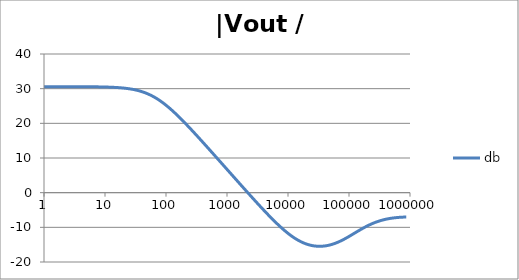
| Category | db |
|---|---|
| 1.0 | 30.579 |
| 1.0715193052376064 | 30.579 |
| 1.1481536214968828 | 30.579 |
| 1.2302687708123814 | 30.578 |
| 1.318256738556407 | 30.578 |
| 1.4125375446227544 | 30.578 |
| 1.513561248436208 | 30.578 |
| 1.6218100973589298 | 30.577 |
| 1.7378008287493754 | 30.577 |
| 1.8620871366628673 | 30.576 |
| 1.9952623149688797 | 30.576 |
| 2.1379620895022318 | 30.575 |
| 2.2908676527677727 | 30.575 |
| 2.45470891568503 | 30.574 |
| 2.6302679918953817 | 30.573 |
| 2.8183829312644537 | 30.572 |
| 3.0199517204020156 | 30.57 |
| 3.235936569296282 | 30.569 |
| 3.467368504525316 | 30.567 |
| 3.7153522909717256 | 30.565 |
| 3.9810717055349727 | 30.563 |
| 4.265795188015926 | 30.561 |
| 4.570881896148749 | 30.558 |
| 4.897788193684462 | 30.555 |
| 5.2480746024977245 | 30.551 |
| 5.62341325190349 | 30.547 |
| 6.025595860743575 | 30.542 |
| 6.456542290346554 | 30.536 |
| 6.918309709189363 | 30.53 |
| 7.4131024130091765 | 30.522 |
| 7.943282347242814 | 30.514 |
| 8.511380382023765 | 30.504 |
| 9.120108393559095 | 30.493 |
| 9.772372209558105 | 30.48 |
| 10.47128548050899 | 30.466 |
| 11.22018454301963 | 30.449 |
| 12.022644346174127 | 30.43 |
| 12.88249551693134 | 30.408 |
| 13.803842646028851 | 30.384 |
| 14.791083881682074 | 30.355 |
| 15.848931924611136 | 30.323 |
| 16.98243652461744 | 30.286 |
| 18.197008586099834 | 30.244 |
| 19.498445997580447 | 30.196 |
| 20.892961308540382 | 30.142 |
| 22.387211385683386 | 30.081 |
| 23.988329190194897 | 30.012 |
| 25.703957827688622 | 29.934 |
| 27.54228703338165 | 29.846 |
| 29.51209226666385 | 29.747 |
| 31.62277660168379 | 29.636 |
| 33.884415613920254 | 29.512 |
| 36.307805477010106 | 29.374 |
| 38.90451449942804 | 29.22 |
| 41.686938347033525 | 29.051 |
| 44.6683592150963 | 28.864 |
| 47.86300923226381 | 28.659 |
| 51.28613839913647 | 28.435 |
| 54.95408738576247 | 28.191 |
| 58.88436553555889 | 27.927 |
| 63.09573444801931 | 27.642 |
| 67.60829753919813 | 27.337 |
| 72.44359600749901 | 27.011 |
| 77.62471166286915 | 26.664 |
| 83.17637711026705 | 26.298 |
| 89.12509381337456 | 25.912 |
| 95.49925860214357 | 25.508 |
| 102.32929922807544 | 25.086 |
| 109.64781961431841 | 24.647 |
| 117.48975549395293 | 24.192 |
| 125.89254117941665 | 23.723 |
| 134.89628825916537 | 23.24 |
| 144.54397707459273 | 22.745 |
| 154.88166189124806 | 22.238 |
| 165.95869074375608 | 21.721 |
| 177.82794100389225 | 21.195 |
| 190.5460717963248 | 20.66 |
| 204.17379446695278 | 20.117 |
| 218.77616239495524 | 19.568 |
| 234.42288153199212 | 19.013 |
| 251.18864315095806 | 18.452 |
| 269.15348039269156 | 17.887 |
| 288.4031503126605 | 17.317 |
| 309.0295432513591 | 16.744 |
| 331.1311214825911 | 16.168 |
| 354.81338923357566 | 15.588 |
| 380.18939632056095 | 15.006 |
| 407.3802778041123 | 14.422 |
| 436.5158322401654 | 13.836 |
| 467.7351412871979 | 13.249 |
| 501.18723362727184 | 12.66 |
| 537.0317963702526 | 12.069 |
| 575.4399373371566 | 11.478 |
| 616.5950018614822 | 10.886 |
| 660.6934480075952 | 10.293 |
| 707.9457843841375 | 9.699 |
| 758.5775750291831 | 9.105 |
| 812.8305161640983 | 8.511 |
| 870.9635899560801 | 7.916 |
| 933.2543007969903 | 7.321 |
| 999.9999999999998 | 6.726 |
| 1071.5193052376057 | 6.131 |
| 1148.1536214968828 | 5.536 |
| 1230.2687708123801 | 4.941 |
| 1318.2567385564053 | 4.347 |
| 1412.537544622753 | 3.753 |
| 1513.5612484362066 | 3.159 |
| 1621.8100973589292 | 2.566 |
| 1737.8008287493742 | 1.974 |
| 1862.0871366628671 | 1.383 |
| 1995.2623149688786 | 0.793 |
| 2137.9620895022326 | 0.204 |
| 2290.867652767771 | -0.383 |
| 2454.708915685027 | -0.969 |
| 2630.26799189538 | -1.553 |
| 2818.382931264451 | -2.135 |
| 3019.9517204020176 | -2.714 |
| 3235.9365692962774 | -3.29 |
| 3467.368504525316 | -3.863 |
| 3715.352290971724 | -4.432 |
| 3981.07170553497 | -4.996 |
| 4265.795188015923 | -5.556 |
| 4570.881896148745 | -6.11 |
| 4897.788193684463 | -6.659 |
| 5248.074602497726 | -7.2 |
| 5623.413251903489 | -7.733 |
| 6025.595860743574 | -8.258 |
| 6456.54229034655 | -8.772 |
| 6918.309709189357 | -9.276 |
| 7413.102413009165 | -9.768 |
| 7943.282347242815 | -10.247 |
| 8511.380382023763 | -10.712 |
| 9120.108393559092 | -11.161 |
| 9772.3722095581 | -11.593 |
| 10471.285480509003 | -12.006 |
| 11220.184543019639 | -12.401 |
| 12022.64434617411 | -12.775 |
| 12882.495516931338 | -13.127 |
| 13803.842646028841 | -13.456 |
| 14791.083881682063 | -13.762 |
| 15848.931924611119 | -14.044 |
| 16982.436524617453 | -14.301 |
| 18197.008586099837 | -14.533 |
| 19498.445997580417 | -14.739 |
| 20892.961308540387 | -14.919 |
| 22387.211385683382 | -15.074 |
| 23988.32919019488 | -15.202 |
| 25703.957827688606 | -15.306 |
| 27542.28703338167 | -15.383 |
| 29512.092266663854 | -15.436 |
| 31622.77660168378 | -15.463 |
| 33884.41561392023 | -15.466 |
| 36307.805477010166 | -15.444 |
| 38904.514499428085 | -15.397 |
| 41686.93834703348 | -15.327 |
| 44668.35921509631 | -15.233 |
| 47863.00923226382 | -15.115 |
| 51286.13839913646 | -14.974 |
| 54954.08738576241 | -14.812 |
| 58884.365535558936 | -14.627 |
| 63095.73444801934 | -14.422 |
| 67608.29753919817 | -14.198 |
| 72443.59600749899 | -13.956 |
| 77624.71166286913 | -13.697 |
| 83176.37711026703 | -13.423 |
| 89125.09381337445 | -13.137 |
| 95499.25860214363 | -12.839 |
| 102329.29922807543 | -12.533 |
| 109647.81961431848 | -12.221 |
| 117489.75549395289 | -11.905 |
| 125892.54117941685 | -11.587 |
| 134896.28825916522 | -11.271 |
| 144543.97707459255 | -10.957 |
| 154881.66189124787 | -10.649 |
| 165958.69074375575 | -10.349 |
| 177827.9410038922 | -10.058 |
| 190546.07179632425 | -9.778 |
| 204173.79446695274 | -9.51 |
| 218776.16239495497 | -9.256 |
| 234422.88153199226 | -9.016 |
| 251188.64315095753 | -8.791 |
| 269153.480392691 | -8.582 |
| 288403.15031266044 | -8.389 |
| 309029.5432513582 | -8.211 |
| 331131.1214825907 | -8.048 |
| 354813.3892335749 | -7.901 |
| 380189.3963205612 | -7.767 |
| 407380.2778041119 | -7.647 |
| 436515.8322401649 | -7.54 |
| 467735.14128719777 | -7.446 |
| 501187.2336272717 | -7.362 |
| 537031.7963702519 | -7.289 |
| 575439.9373371559 | -7.226 |
| 616595.001861482 | -7.173 |
| 660693.4480075944 | -7.128 |
| 707945.7843841374 | -7.091 |
| 758577.575029183 | -7.062 |
| 812830.5161640996 | -7.041 |
| 870963.5899560791 | -7.026 |